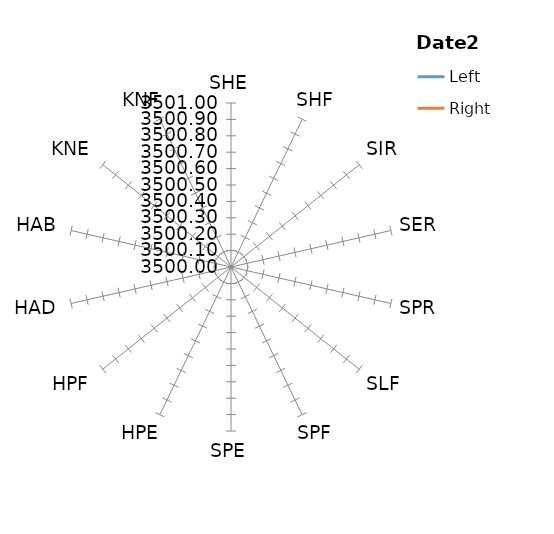
| Category | Left | Right |
|---|---|---|
| SHE | 55.46 | 54.07 |
| SHF | 49.02 | 57.24 |
| SIR | 54.44 | 53.8 |
| SER | 49.31 | 52.5 |
| SPR | 54.11 | 56.04 |
| SLF | 57.49 | 58.59 |
| SPF | 52.71 | 57.44 |
| SPE | 51.68 | 58.27 |
| HPE | 49.61 | 56.64 |
| HPF | 58.96 | 53.65 |
| HAD | 49.74 | 58.88 |
| HAB | 51.77 | 52.92 |
| KNE | 57.77 | 55.7 |
| KNF | 59.42 | 55.27 |